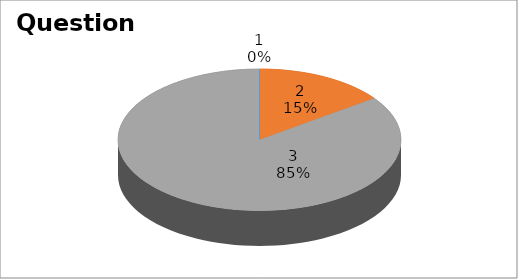
| Category | Series 0 |
|---|---|
| 0 | 0 |
| 1 | 9 |
| 2 | 51 |